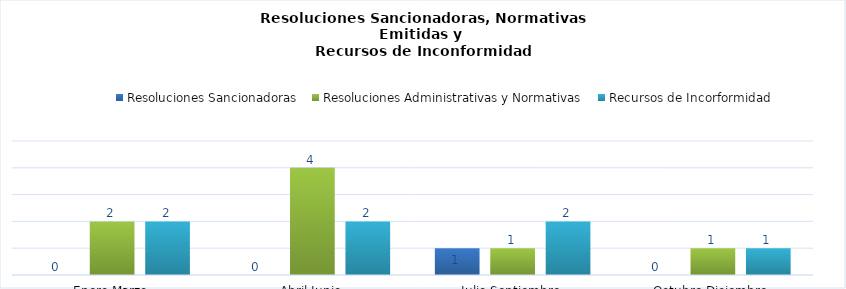
| Category | Resoluciones Sancionadoras | Resoluciones Administrativas y Normativas | Recursos de Incorformidad |
|---|---|---|---|
| Enero-Marzo | 0 | 2 | 2 |
| Abril-Junio | 0 | 4 | 2 |
| Julio-Septiembre | 1 | 1 | 2 |
| Octubre-Diciembre | 0 | 1 | 1 |